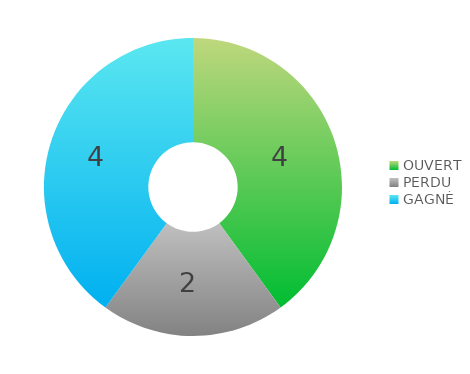
| Category | Series 0 |
|---|---|
| OUVERT | 4 |
| PERDU | 2 |
| GAGNÉ | 4 |